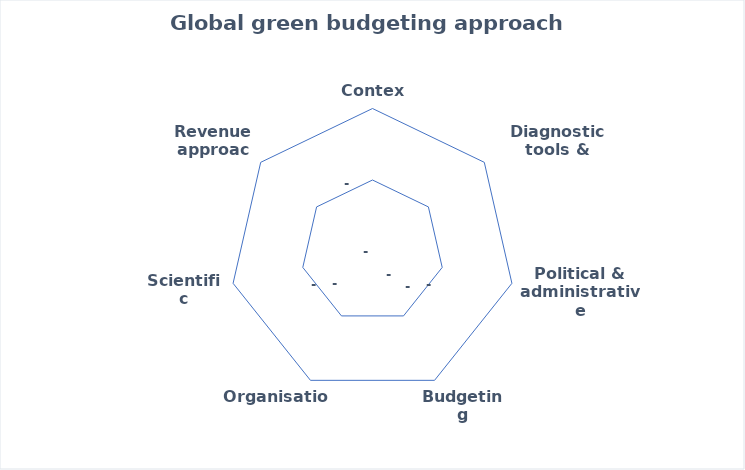
| Category | Series 3 |
|---|---|
| Context | 0 |
| Diagnostic tools & indicators | 0 |
| Political & administrative commitment | 0 |
| Budgeting practices | 0 |
| Organisation | 0 |
| Scientific approach | 0 |
| Revenue approach | 0 |